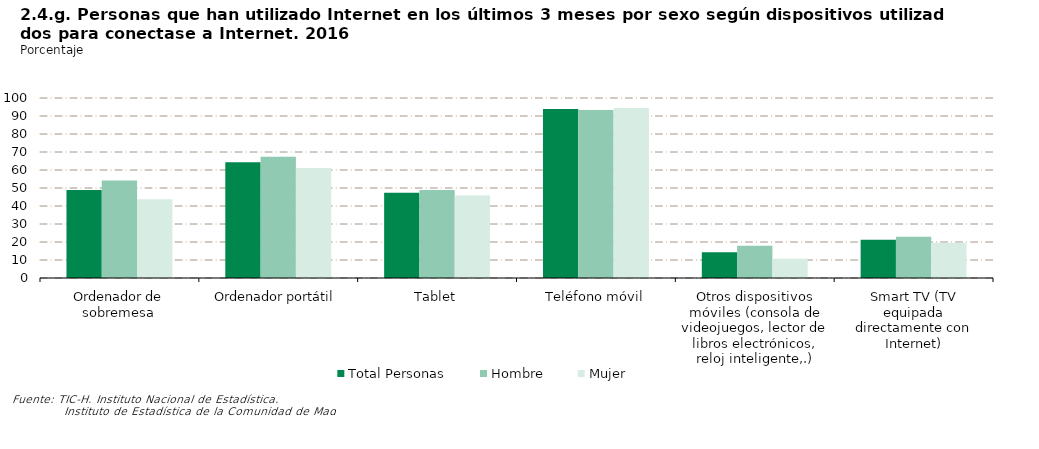
| Category | Total Personas | Hombre | Mujer |
|---|---|---|---|
| Ordenador de sobremesa | 48.95 | 54.105 | 43.777 |
| Ordenador portátil | 64.255 | 67.358 | 61.142 |
| Tablet | 47.378 | 48.899 | 45.853 |
| Teléfono móvil | 93.88 | 93.303 | 94.459 |
| Otros dispositivos móviles (consola de videojuegos, lector de libros electrónicos, reloj inteligente,.) | 14.297 | 17.883 | 10.699 |
| Smart TV (TV equipada directamente con Internet) | 21.269 | 22.979 | 19.554 |